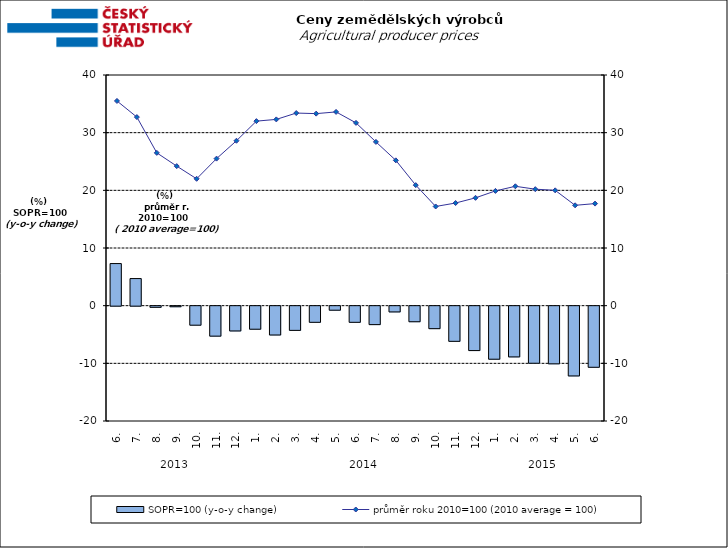
| Category | SOPR=100 (y-o-y change)   |
|---|---|
| 0 | 7.3 |
| 1 | 4.7 |
| 2 | -0.2 |
| 3 | -0.1 |
| 4 | -3.3 |
| 5 | -5.2 |
| 6 | -4.3 |
| 7 | -4 |
| 8 | -5 |
| 9 | -4.2 |
| 10 | -2.8 |
| 11 | -0.7 |
| 12 | -2.8 |
| 13 | -3.2 |
| 14 | -1 |
| 15 | -2.7 |
| 16 | -3.9 |
| 17 | -6.1 |
| 18 | -7.7 |
| 19 | -9.2 |
| 20 | -8.8 |
| 21 | -9.9 |
| 22 | -10 |
| 23 | -12.1 |
| 24 | -10.6 |